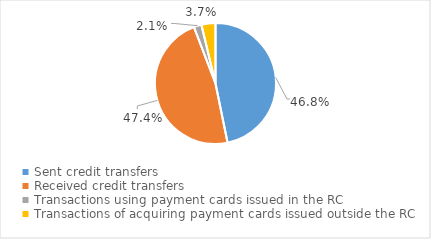
| Category | Series 0 |
|---|---|
| Sent credit transfers | 270260116117 |
| Received credit transfers | 273698622950 |
| Transactions using payment cards issued in the RC | 11913563395 |
| Transactions of acquiring payment cards issued outside the RC | 21645619856 |